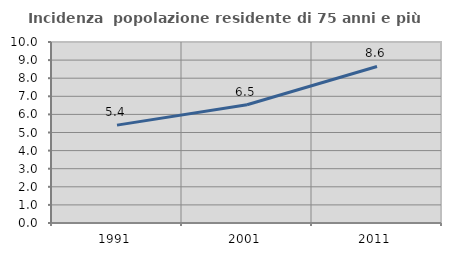
| Category | Incidenza  popolazione residente di 75 anni e più |
|---|---|
| 1991.0 | 5.408 |
| 2001.0 | 6.535 |
| 2011.0 | 8.648 |